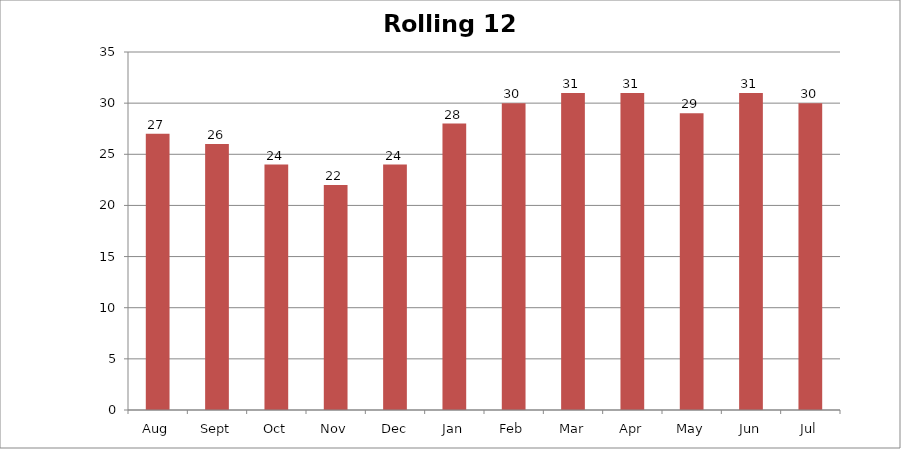
| Category | Rolling 12 Month |
|---|---|
| Aug | 27 |
| Sept | 26 |
| Oct | 24 |
| Nov | 22 |
| Dec | 24 |
| Jan | 28 |
| Feb | 30 |
| Mar | 31 |
| Apr | 31 |
| May | 29 |
| Jun | 31 |
| Jul | 30 |